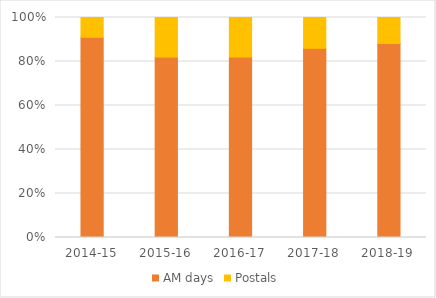
| Category | AM days | Postals |
|---|---|---|
| 2014-15 | 0.91 | 0.09 |
| 2015-16 | 0.82 | 0.18 |
| 2016-17 | 0.82 | 0.18 |
| 2017-18 | 0.86 | 0.14 |
| 2018-19 | 0.882 | 0.118 |